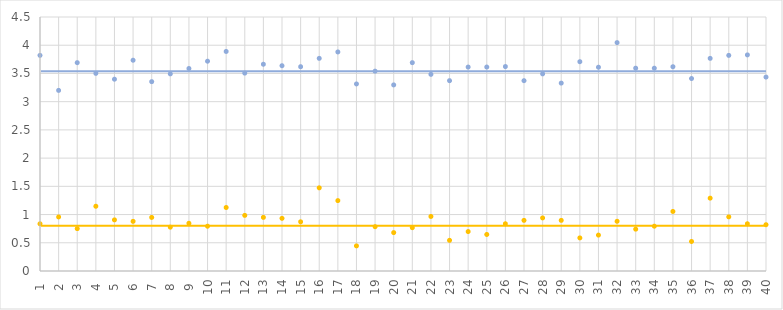
| Category | Ref-0,80 | ref-3,54 |
|---|---|---|
| 1.0 | 0.8 | 3.54 |
| 2.0 | 0.8 | 3.54 |
| 3.0 | 0.8 | 3.54 |
| 4.0 | 0.8 | 3.54 |
| 5.0 | 0.8 | 3.54 |
| 6.0 | 0.8 | 3.54 |
| 7.0 | 0.8 | 3.54 |
| 8.0 | 0.8 | 3.54 |
| 9.0 | 0.8 | 3.54 |
| 10.0 | 0.8 | 3.54 |
| 11.0 | 0.8 | 3.54 |
| 12.0 | 0.8 | 3.54 |
| 13.0 | 0.8 | 3.54 |
| 14.0 | 0.8 | 3.54 |
| 15.0 | 0.8 | 3.54 |
| 16.0 | 0.8 | 3.54 |
| 17.0 | 0.8 | 3.54 |
| 18.0 | 0.8 | 3.54 |
| 19.0 | 0.8 | 3.54 |
| 20.0 | 0.8 | 3.54 |
| 21.0 | 0.8 | 3.54 |
| 22.0 | 0.8 | 3.54 |
| 23.0 | 0.8 | 3.54 |
| 24.0 | 0.8 | 3.54 |
| 25.0 | 0.8 | 3.54 |
| 26.0 | 0.8 | 3.54 |
| 27.0 | 0.8 | 3.54 |
| 28.0 | 0.8 | 3.54 |
| 29.0 | 0.8 | 3.54 |
| 30.0 | 0.8 | 3.54 |
| 31.0 | 0.8 | 3.54 |
| 32.0 | 0.8 | 3.54 |
| 33.0 | 0.8 | 3.54 |
| 34.0 | 0.8 | 3.54 |
| 35.0 | 0.8 | 3.54 |
| 36.0 | 0.8 | 3.54 |
| 37.0 | 0.8 | 3.54 |
| 38.0 | 0.8 | 3.54 |
| 39.0 | 0.8 | 3.54 |
| 40.0 | 0.8 | 3.54 |